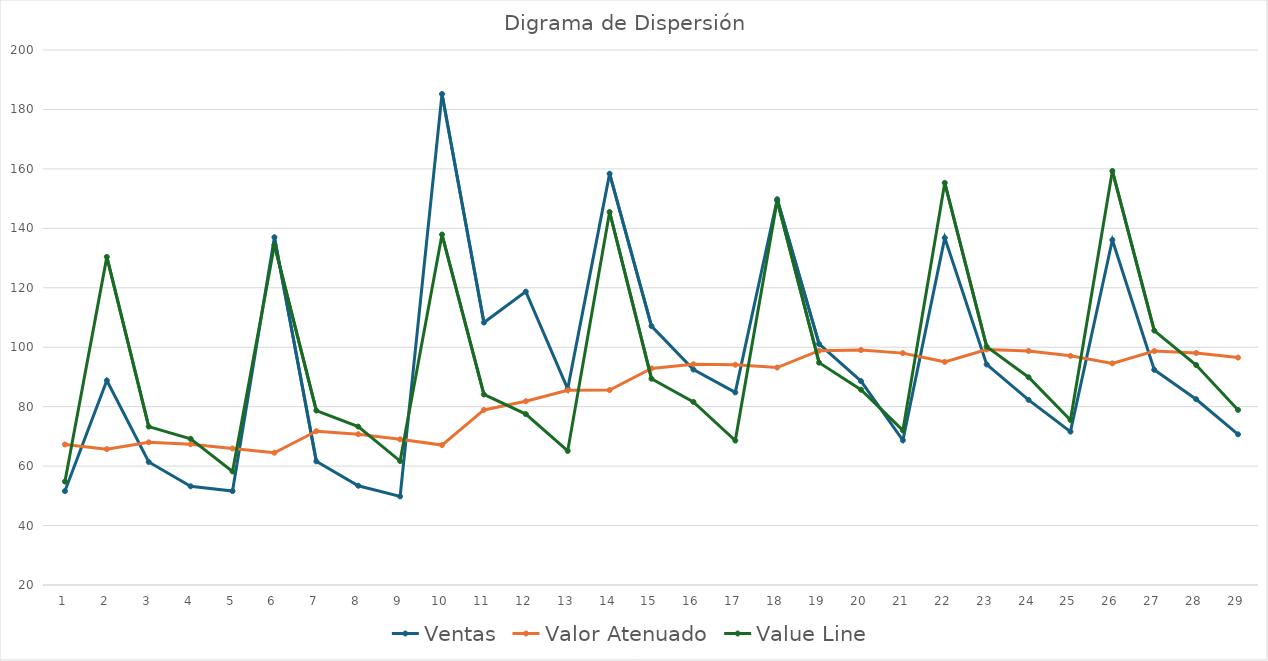
| Category | Ventas | Valor Atenuado | Value Line |
|---|---|---|---|
| 0 | 51.6 | 67.267 | 54.8 |
| 1 | 88.8 | 65.7 | 130.4 |
| 2 | 61.4 | 68.01 | 73.3 |
| 3 | 53.2 | 67.349 | 69.2 |
| 4 | 51.6 | 65.934 | 58.2 |
| 5 | 137 | 64.501 | 134.4 |
| 6 | 61.6 | 71.751 | 78.7 |
| 7 | 53.4 | 70.736 | 73.3 |
| 8 | 49.8 | 69.002 | 61.7 |
| 9 | 185.2 | 67.082 | 137.9 |
| 10 | 108.3 | 78.894 | 84.1 |
| 11 | 118.7 | 81.834 | 77.5 |
| 12 | 86 | 85.521 | 65.1 |
| 13 | 158.4 | 85.569 | 145.5 |
| 14 | 107.1 | 92.852 | 89.4 |
| 15 | 92.5 | 94.277 | 81.6 |
| 16 | 84.8 | 94.099 | 68.6 |
| 17 | 149.8 | 93.169 | 149.3 |
| 18 | 101.1 | 98.832 | 94.8 |
| 19 | 88.6 | 99.059 | 85.7 |
| 20 | 68.7 | 98.013 | 72 |
| 21 | 136.8 | 95.082 | 155.3 |
| 22 | 94.2 | 99.254 | 100.2 |
| 23 | 82.3 | 98.748 | 89.9 |
| 24 | 71.6 | 97.103 | 75.5 |
| 25 | 136.1 | 94.553 | 159.3 |
| 26 | 92.4 | 98.708 | 105.6 |
| 27 | 82.5 | 98.077 | 94 |
| 28 | 70.7 | 96.519 | 78.9 |